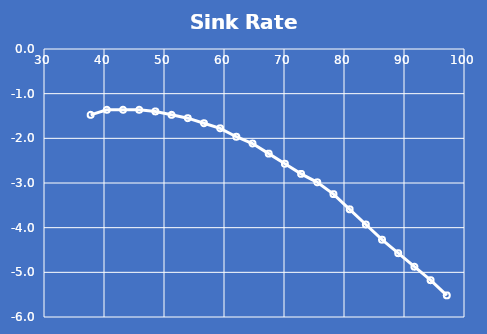
| Category | Sink Rate (kt) |
|---|---|
| 37.772827738637936 | -1.473 |
| 40.470886862826355 | -1.36 |
| 43.16894598701478 | -1.36 |
| 45.867005111203206 | -1.36 |
| 48.56506423539163 | -1.398 |
| 51.26312335958006 | -1.473 |
| 53.961182483768475 | -1.549 |
| 56.6592416079569 | -1.662 |
| 59.357300732145326 | -1.776 |
| 62.05535985633375 | -1.965 |
| 64.75341898052217 | -2.116 |
| 67.4514781047106 | -2.342 |
| 70.14953722889902 | -2.569 |
| 72.84759635308744 | -2.796 |
| 75.54565547727587 | -2.985 |
| 78.24371460146429 | -3.249 |
| 80.94177372565271 | -3.589 |
| 83.63983284984114 | -3.929 |
| 86.33789197402956 | -4.269 |
| 89.03595109821799 | -4.572 |
| 91.73401022240641 | -4.874 |
| 94.43206934659483 | -5.176 |
| 97.13012847078326 | -5.516 |